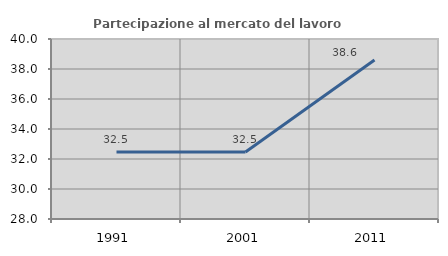
| Category | Partecipazione al mercato del lavoro  femminile |
|---|---|
| 1991.0 | 32.463 |
| 2001.0 | 32.468 |
| 2011.0 | 38.602 |